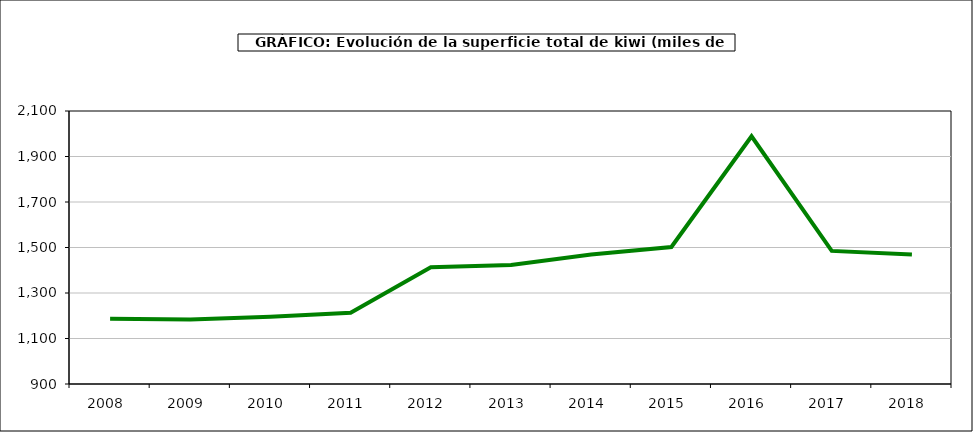
| Category | superficie kiwi |
|---|---|
| 2008.0 | 1187 |
| 2009.0 | 1183 |
| 2010.0 | 1196 |
| 2011.0 | 1213 |
| 2012.0 | 1413 |
| 2013.0 | 1423 |
| 2014.0 | 1469 |
| 2015.0 | 1502 |
| 2016.0 | 1989 |
| 2017.0 | 1485 |
| 2018.0 | 1469 |